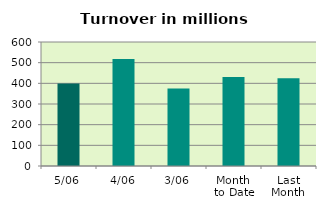
| Category | Series 0 |
|---|---|
| 5/06 | 399.397 |
| 4/06 | 517.917 |
| 3/06 | 374.718 |
| Month 
to Date | 430.677 |
| Last
Month | 424.091 |